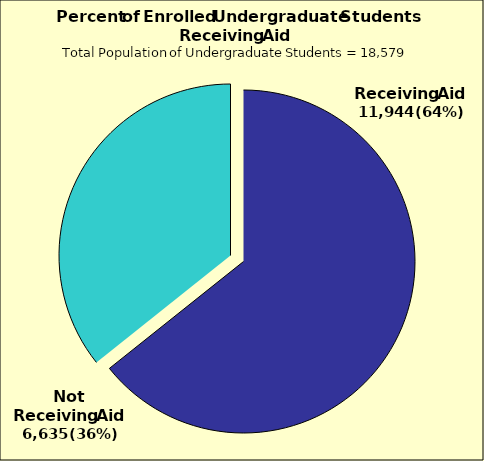
| Category | Series 0 |
|---|---|
| 0 | 11944 |
| 1 | 6635 |